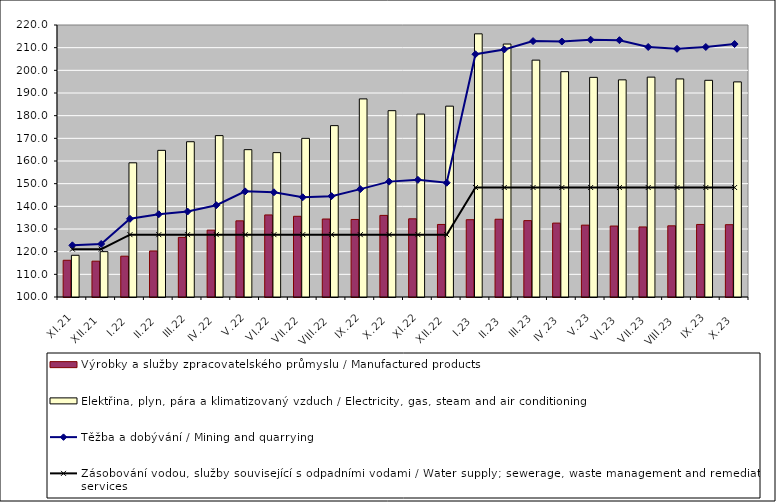
| Category | Výrobky a služby zpracovatelského průmyslu / Manufactured products | Elektřina, plyn, pára a klimatizovaný vzduch / Electricity, gas, steam and air conditioning |
|---|---|---|
| XI.21 | 116.2 | 118.4 |
| XII.21 | 115.8 | 120 |
| I.22 | 118 | 159.2 |
| II.22 | 120.3 | 164.7 |
| III.22 | 126.3 | 168.5 |
| IV.22 | 129.5 | 171.2 |
| V.22 | 133.6 | 165 |
| VI.22 | 136.2 | 163.7 |
| VII.22 | 135.6 | 170 |
| VIII.22 | 134.4 | 175.6 |
| IX.22 | 134.2 | 187.4 |
| X.22 | 136 | 182.2 |
| XI.22 | 134.5 | 180.7 |
| XII.22 | 132 | 184.2 |
| I.23 | 134.1 | 216.1 |
| II.23 | 134.3 | 211.6 |
| III.23 | 133.7 | 204.5 |
| IV.23 | 132.6 | 199.4 |
| V.23 | 131.7 | 196.9 |
| VI.23 | 131.3 | 195.8 |
| VII.23 | 130.9 | 197 |
| VIII.23 | 131.4 | 196.2 |
| IX.23 | 132 | 195.6 |
| X.23 | 131.9 | 194.9 |